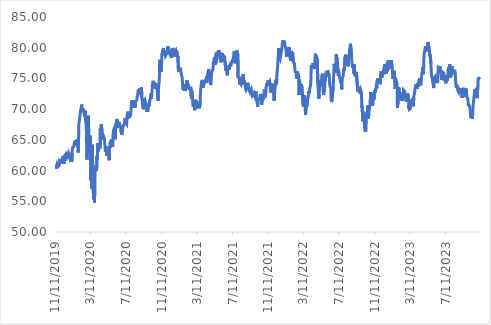
| Category | Series 0 |
|---|---|
| 11/11/19 | 60.478 |
| 11/12/19 | 60.569 |
| 11/13/19 | 60.787 |
| 11/14/19 | 60.569 |
| 11/15/19 | 60.323 |
| 11/18/19 | 61.014 |
| 11/19/19 | 61.042 |
| 11/20/19 | 61.087 |
| 11/21/19 | 60.669 |
| 11/22/19 | 60.632 |
| 11/25/19 | 60.878 |
| 11/26/19 | 61.614 |
| 11/27/19 | 61.514 |
| 11/29/19 | 61.641 |
| 12/2/19 | 61.414 |
| 12/3/19 | 61.169 |
| 12/4/19 | 61.878 |
| 12/5/19 | 61.641 |
| 12/6/19 | 62.023 |
| 12/9/19 | 62.35 |
| 12/10/19 | 61.741 |
| 12/11/19 | 61.314 |
| 12/12/19 | 61.105 |
| 12/13/19 | 62.432 |
| 12/16/19 | 62.596 |
| 12/17/19 | 61.66 |
| 12/18/19 | 62.05 |
| 12/19/19 | 62.114 |
| 12/20/19 | 62.578 |
| 12/23/19 | 62.459 |
| 12/24/19 | 62.305 |
| 12/26/19 | 62.332 |
| 12/27/19 | 62.877 |
| 12/30/19 | 62.523 |
| 12/31/19 | 62.568 |
| 1/2/20 | 61.914 |
| 1/3/20 | 61.823 |
| 1/6/20 | 62.25 |
| 1/7/20 | 61.396 |
| 1/8/20 | 62.959 |
| 1/9/20 | 63.496 |
| 1/10/20 | 63.759 |
| 1/13/20 | 63.75 |
| 1/14/20 | 63.886 |
| 1/15/20 | 64.35 |
| 1/16/20 | 64.304 |
| 1/17/20 | 64.695 |
| 1/21/20 | 64.795 |
| 1/22/20 | 64.493 |
| 1/23/20 | 64.567 |
| 1/24/20 | 64.283 |
| 1/27/20 | 64.1 |
| 1/28/20 | 63.744 |
| 1/29/20 | 62.939 |
| 1/30/20 | 63.524 |
| 1/31/20 | 67.465 |
| 2/3/20 | 68.517 |
| 2/4/20 | 68.947 |
| 2/5/20 | 69.248 |
| 2/6/20 | 69.779 |
| 2/7/20 | 69.523 |
| 2/10/20 | 70.73 |
| 2/11/20 | 69.596 |
| 2/12/20 | 69.45 |
| 2/13/20 | 69.834 |
| 2/14/20 | 70.126 |
| 2/18/20 | 69.559 |
| 2/19/20 | 69.075 |
| 2/20/20 | 68.727 |
| 2/21/20 | 69.742 |
| 2/24/20 | 68.051 |
| 2/25/20 | 67.484 |
| 2/26/20 | 66.679 |
| 2/27/20 | 64.146 |
| 2/28/20 | 61.787 |
| 3/2/20 | 66.24 |
| 3/3/20 | 65.637 |
| 3/4/20 | 68.919 |
| 3/5/20 | 66.149 |
| 3/6/20 | 66.304 |
| 3/9/20 | 64 |
| 3/10/20 | 65.664 |
| 3/11/20 | 63.003 |
| 3/12/20 | 58.422 |
| 3/13/20 | 63.186 |
| 3/16/20 | 57.004 |
| 3/17/20 | 64.192 |
| 3/18/20 | 61.897 |
| 3/19/20 | 60.946 |
| 3/20/20 | 56.767 |
| 3/23/20 | 55.295 |
| 3/24/20 | 55.944 |
| 3/25/20 | 54.764 |
| 3/26/20 | 58.358 |
| 3/27/20 | 59.675 |
| 3/30/20 | 60.882 |
| 3/31/20 | 60.68 |
| 4/1/20 | 59.94 |
| 4/2/20 | 62.335 |
| 4/3/20 | 61.833 |
| 4/6/20 | 64.466 |
| 4/7/20 | 63.131 |
| 4/8/20 | 64.21 |
| 4/9/20 | 63.927 |
| 4/13/20 | 63.542 |
| 4/14/20 | 66.853 |
| 4/15/20 | 66.432 |
| 4/16/20 | 66.606 |
| 4/17/20 | 67.544 |
| 4/20/20 | 66.385 |
| 4/21/20 | 64.959 |
| 4/22/20 | 65.511 |
| 4/23/20 | 65.529 |
| 4/24/20 | 65.686 |
| 4/27/20 | 65.345 |
| 4/28/20 | 65.419 |
| 4/29/20 | 64.545 |
| 4/30/20 | 64.646 |
| 5/1/20 | 63.045 |
| 5/4/20 | 63.919 |
| 5/5/20 | 63.956 |
| 5/6/20 | 62.411 |
| 5/7/20 | 63.294 |
| 5/8/20 | 63.818 |
| 5/11/20 | 63.827 |
| 5/12/20 | 63.229 |
| 5/13/20 | 62.834 |
| 5/14/20 | 61.693 |
| 5/15/20 | 63.432 |
| 5/18/20 | 64.6 |
| 5/19/20 | 63.708 |
| 5/20/20 | 64.83 |
| 5/21/20 | 64.637 |
| 5/22/20 | 65.088 |
| 5/26/20 | 63.873 |
| 5/27/20 | 64.941 |
| 5/28/20 | 66.321 |
| 5/29/20 | 66.541 |
| 6/1/20 | 66.909 |
| 6/2/20 | 66.643 |
| 6/3/20 | 65.916 |
| 6/4/20 | 65.088 |
| 6/5/20 | 66.606 |
| 6/8/20 | 67.627 |
| 6/9/20 | 67.415 |
| 6/10/20 | 68.409 |
| 6/11/20 | 67.25 |
| 6/12/20 | 66.965 |
| 6/15/20 | 67.057 |
| 6/16/20 | 67.645 |
| 6/17/20 | 67.903 |
| 6/18/20 | 67.719 |
| 6/19/20 | 67.489 |
| 6/22/20 | 67.25 |
| 6/23/20 | 67.084 |
| 6/24/20 | 66.265 |
| 6/25/20 | 66.827 |
| 6/26/20 | 65.796 |
| 6/29/20 | 66.633 |
| 6/30/20 | 67.397 |
| 7/1/20 | 67.185 |
| 7/2/20 | 67.415 |
| 7/6/20 | 67.572 |
| 7/7/20 | 68.05 |
| 7/8/20 | 68.529 |
| 7/9/20 | 67.452 |
| 7/10/20 | 67.783 |
| 7/13/20 | 67.581 |
| 7/14/20 | 68.86 |
| 7/15/20 | 68.713 |
| 7/16/20 | 68.979 |
| 7/17/20 | 69.59 |
| 7/20/20 | 68.665 |
| 7/21/20 | 68.517 |
| 7/22/20 | 68.609 |
| 7/23/20 | 68.692 |
| 7/24/20 | 68.776 |
| 7/27/20 | 69.081 |
| 7/28/20 | 70.062 |
| 7/29/20 | 70.515 |
| 7/30/20 | 71.135 |
| 7/31/20 | 71.441 |
| 8/3/20 | 70.858 |
| 8/4/20 | 71.043 |
| 8/5/20 | 70.497 |
| 8/6/20 | 70.201 |
| 8/7/20 | 70.552 |
| 8/10/20 | 70.932 |
| 8/11/20 | 70.293 |
| 8/12/20 | 71.478 |
| 8/13/20 | 71.237 |
| 8/14/20 | 71.302 |
| 8/17/20 | 71.45 |
| 8/18/20 | 71.857 |
| 8/19/20 | 72.135 |
| 8/20/20 | 72.413 |
| 8/21/20 | 72.82 |
| 8/24/20 | 73.227 |
| 8/25/20 | 72.727 |
| 8/26/20 | 72.783 |
| 8/27/20 | 73.162 |
| 8/28/20 | 73.449 |
| 8/31/20 | 73.347 |
| 9/1/20 | 72.264 |
| 9/2/20 | 73.542 |
| 9/3/20 | 71.876 |
| 9/4/20 | 71.45 |
| 9/8/20 | 69.997 |
| 9/9/20 | 71.783 |
| 9/10/20 | 70.71 |
| 9/11/20 | 71.024 |
| 9/14/20 | 71.395 |
| 9/15/20 | 71.2 |
| 9/16/20 | 71.173 |
| 9/17/20 | 70.987 |
| 9/18/20 | 70.173 |
| 9/21/20 | 69.581 |
| 9/22/20 | 70.395 |
| 9/23/20 | 69.535 |
| 9/24/20 | 70.108 |
| 9/25/20 | 70.284 |
| 9/28/20 | 70.895 |
| 9/29/20 | 70.534 |
| 9/30/20 | 71.395 |
| 10/1/20 | 71.311 |
| 10/2/20 | 71.626 |
| 10/5/20 | 72.57 |
| 10/6/20 | 71.756 |
| 10/7/20 | 72.301 |
| 10/8/20 | 72.866 |
| 10/9/20 | 73.819 |
| 10/12/20 | 74.615 |
| 10/13/20 | 74.273 |
| 10/14/20 | 73.902 |
| 10/15/20 | 73.764 |
| 10/16/20 | 74.319 |
| 10/19/20 | 73.301 |
| 10/20/20 | 73.875 |
| 10/21/20 | 74.217 |
| 10/22/20 | 73.78 |
| 10/23/20 | 73.826 |
| 10/26/20 | 73.221 |
| 10/27/20 | 73.37 |
| 10/28/20 | 71.519 |
| 10/29/20 | 71.342 |
| 10/30/20 | 73.408 |
| 11/2/20 | 74.589 |
| 11/3/20 | 77.334 |
| 11/4/20 | 78.032 |
| 11/5/20 | 77.241 |
| 11/6/20 | 77.26 |
| 11/9/20 | 76.097 |
| 11/10/20 | 77.558 |
| 11/11/20 | 79.028 |
| 11/12/20 | 78.842 |
| 11/13/20 | 79.428 |
| 11/16/20 | 79.958 |
| 11/17/20 | 79.419 |
| 11/18/20 | 78.73 |
| 11/19/20 | 79.446 |
| 11/20/20 | 79.242 |
| 11/23/20 | 78.665 |
| 11/24/20 | 78.823 |
| 11/25/20 | 78.86 |
| 11/27/20 | 79 |
| 11/30/20 | 79.688 |
| 12/1/20 | 80.265 |
| 12/2/20 | 79.781 |
| 12/3/20 | 79.27 |
| 12/4/20 | 79.121 |
| 12/7/20 | 79.456 |
| 12/8/20 | 79.251 |
| 12/9/20 | 78.86 |
| 12/10/20 | 78.711 |
| 12/11/20 | 78.795 |
| 12/14/20 | 78.339 |
| 12/15/20 | 78.86 |
| 12/16/20 | 79.13 |
| 12/17/20 | 79.707 |
| 12/18/20 | 79.958 |
| 12/21/20 | 79.381 |
| 12/22/20 | 78.535 |
| 12/23/20 | 78.563 |
| 12/24/20 | 79.13 |
| 12/28/20 | 79.474 |
| 12/29/20 | 79.121 |
| 12/30/20 | 78.842 |
| 12/31/20 | 79.567 |
| 1/4/21 | 78.469 |
| 1/5/21 | 78.646 |
| 1/6/21 | 76.534 |
| 1/7/21 | 76.115 |
| 1/8/21 | 76.627 |
| 1/11/21 | 76.432 |
| 1/12/21 | 76.543 |
| 1/13/21 | 76.757 |
| 1/14/21 | 76.246 |
| 1/15/21 | 76.19 |
| 1/19/21 | 75.231 |
| 1/20/21 | 74.626 |
| 1/21/21 | 73.77 |
| 1/22/21 | 73.162 |
| 1/25/21 | 73.555 |
| 1/26/21 | 73.686 |
| 1/27/21 | 73.013 |
| 1/28/21 | 74.061 |
| 1/29/21 | 72.984 |
| 2/1/21 | 73.471 |
| 2/2/21 | 73.78 |
| 2/3/21 | 73.808 |
| 2/4/21 | 73.855 |
| 2/5/21 | 74.734 |
| 2/8/21 | 74.575 |
| 2/9/21 | 73.639 |
| 2/10/21 | 74.023 |
| 2/11/21 | 73.368 |
| 2/12/21 | 73.387 |
| 2/16/21 | 73.162 |
| 2/17/21 | 73.396 |
| 2/18/21 | 73.658 |
| 2/19/21 | 72.236 |
| 2/22/21 | 72.301 |
| 2/23/21 | 72.507 |
| 2/24/21 | 71.712 |
| 2/25/21 | 71.759 |
| 2/26/21 | 70.364 |
| 3/1/21 | 70.739 |
| 3/2/21 | 70.57 |
| 3/3/21 | 69.812 |
| 3/4/21 | 69.653 |
| 3/5/21 | 71.169 |
| 3/8/21 | 71.534 |
| 3/9/21 | 70.121 |
| 3/10/21 | 70.926 |
| 3/11/21 | 70.43 |
| 3/12/21 | 70.655 |
| 3/15/21 | 70.814 |
| 3/16/21 | 70.982 |
| 3/17/21 | 70.926 |
| 3/18/21 | 71.179 |
| 3/19/21 | 70.159 |
| 3/22/21 | 70.898 |
| 3/23/21 | 72.751 |
| 3/24/21 | 72.769 |
| 3/25/21 | 72.882 |
| 3/26/21 | 74.126 |
| 3/29/21 | 74.762 |
| 3/30/21 | 74.229 |
| 3/31/21 | 73.761 |
| 4/1/21 | 73.499 |
| 4/5/21 | 74.416 |
| 4/6/21 | 74.725 |
| 4/7/21 | 74.5 |
| 4/8/21 | 74.519 |
| 4/9/21 | 74.65 |
| 4/12/21 | 75.006 |
| 4/13/21 | 74.603 |
| 4/14/21 | 74.294 |
| 4/15/21 | 75.286 |
| 4/16/21 | 75.511 |
| 4/19/21 | 75.202 |
| 4/20/21 | 76.529 |
| 4/21/21 | 76.359 |
| 4/22/21 | 76.265 |
| 4/23/21 | 75.08 |
| 4/26/21 | 74.6 |
| 4/27/21 | 73.922 |
| 4/28/21 | 74.12 |
| 4/29/21 | 75.108 |
| 4/30/21 | 75.936 |
| 5/3/21 | 76.284 |
| 5/4/21 | 76.303 |
| 5/5/21 | 76.519 |
| 5/6/21 | 77.451 |
| 5/7/21 | 77.329 |
| 5/10/21 | 78.42 |
| 5/11/21 | 77.573 |
| 5/12/21 | 77.206 |
| 5/13/21 | 78.345 |
| 5/14/21 | 78.627 |
| 5/17/21 | 78.618 |
| 5/18/21 | 78.204 |
| 5/19/21 | 78.298 |
| 5/20/21 | 79.126 |
| 5/21/21 | 79.258 |
| 5/24/21 | 79.418 |
| 5/25/21 | 79.596 |
| 5/26/21 | 79.446 |
| 5/27/21 | 78.749 |
| 5/28/21 | 78.834 |
| 6/1/21 | 77.611 |
| 6/2/21 | 77.987 |
| 6/3/21 | 78.994 |
| 6/4/21 | 79.013 |
| 6/7/21 | 78.947 |
| 6/8/21 | 78.034 |
| 6/9/21 | 77.686 |
| 6/10/21 | 78.665 |
| 6/11/21 | 78.693 |
| 6/14/21 | 78.486 |
| 6/15/21 | 78.354 |
| 6/16/21 | 77.112 |
| 6/17/21 | 77.564 |
| 6/18/21 | 76.237 |
| 6/21/21 | 76.632 |
| 6/22/21 | 76.491 |
| 6/23/21 | 75.513 |
| 6/24/21 | 75.804 |
| 6/25/21 | 76.651 |
| 6/28/21 | 76.896 |
| 6/29/21 | 76.454 |
| 6/30/21 | 76.548 |
| 7/1/21 | 76.915 |
| 7/2/21 | 76.877 |
| 7/6/21 | 77.131 |
| 7/7/21 | 77.78 |
| 7/8/21 | 77.479 |
| 7/9/21 | 77.564 |
| 7/12/21 | 78.034 |
| 7/13/21 | 77.761 |
| 7/14/21 | 78.317 |
| 7/15/21 | 78.693 |
| 7/16/21 | 79.408 |
| 7/19/21 | 79.013 |
| 7/20/21 | 78.228 |
| 7/21/21 | 77.745 |
| 7/22/21 | 77.424 |
| 7/23/21 | 78.786 |
| 7/26/21 | 79.552 |
| 7/27/21 | 79.42 |
| 7/28/21 | 78.691 |
| 7/29/21 | 79.013 |
| 7/30/21 | 75.21 |
| 8/2/21 | 75.248 |
| 8/3/21 | 75.134 |
| 8/4/21 | 74.027 |
| 8/5/21 | 74.642 |
| 8/6/21 | 74.387 |
| 8/9/21 | 74.112 |
| 8/10/21 | 74.481 |
| 8/11/21 | 74.831 |
| 8/12/21 | 74.538 |
| 8/13/21 | 75.153 |
| 8/16/21 | 75.475 |
| 8/17/21 | 75.711 |
| 8/18/21 | 73.942 |
| 8/19/21 | 74.708 |
| 8/20/21 | 74.548 |
| 8/23/21 | 74.15 |
| 8/24/21 | 73.479 |
| 8/25/21 | 73.46 |
| 8/26/21 | 73.138 |
| 8/27/21 | 73.261 |
| 8/30/21 | 73.46 |
| 8/31/21 | 73.744 |
| 9/1/21 | 74.103 |
| 9/2/21 | 74.283 |
| 9/3/21 | 73.706 |
| 9/7/21 | 72.75 |
| 9/8/21 | 73.583 |
| 9/9/21 | 73.129 |
| 9/10/21 | 72.883 |
| 9/13/21 | 73.204 |
| 9/14/21 | 73.129 |
| 9/15/21 | 73.043 |
| 9/16/21 | 72.343 |
| 9/17/21 | 72.116 |
| 9/20/21 | 72.06 |
| 9/21/21 | 72.268 |
| 9/22/21 | 72.306 |
| 9/23/21 | 72.533 |
| 9/24/21 | 72.495 |
| 9/27/21 | 71.908 |
| 9/28/21 | 71.728 |
| 9/29/21 | 72.92 |
| 9/30/21 | 71.501 |
| 10/1/21 | 71.501 |
| 10/4/21 | 71.009 |
| 10/5/21 | 70.404 |
| 10/6/21 | 71.047 |
| 10/7/21 | 71.511 |
| 10/8/21 | 71.511 |
| 10/11/21 | 71.71 |
| 10/12/21 | 71.587 |
| 10/13/21 | 71.965 |
| 10/14/21 | 72.466 |
| 10/15/21 | 72.135 |
| 10/18/21 | 71.218 |
| 10/19/21 | 70.745 |
| 10/20/21 | 71.477 |
| 10/21/21 | 71.278 |
| 10/22/21 | 71.858 |
| 10/25/21 | 71.516 |
| 10/26/21 | 72.486 |
| 10/27/21 | 72.239 |
| 10/28/21 | 73.172 |
| 10/29/21 | 72.515 |
| 11/1/21 | 72.286 |
| 11/2/21 | 72.591 |
| 11/3/21 | 73.543 |
| 11/4/21 | 73.562 |
| 11/5/21 | 74.085 |
| 11/8/21 | 73.99 |
| 11/9/21 | 74.285 |
| 11/10/21 | 74.694 |
| 11/11/21 | 74.228 |
| 11/12/21 | 74.266 |
| 11/15/21 | 74.523 |
| 11/16/21 | 74.123 |
| 11/17/21 | 73.838 |
| 11/18/21 | 72.705 |
| 11/19/21 | 73.476 |
| 11/22/21 | 73.819 |
| 11/23/21 | 74.171 |
| 11/24/21 | 74.009 |
| 11/26/21 | 73.343 |
| 11/29/21 | 73.962 |
| 11/30/21 | 71.401 |
| 12/1/21 | 71.753 |
| 12/2/21 | 71.839 |
| 12/3/21 | 73.067 |
| 12/6/21 | 74.79 |
| 12/7/21 | 74.057 |
| 12/8/21 | 74.009 |
| 12/9/21 | 74.238 |
| 12/10/21 | 75.637 |
| 12/13/21 | 77.226 |
| 12/14/21 | 78.168 |
| 12/15/21 | 78.768 |
| 12/16/21 | 79.901 |
| 12/17/21 | 78.501 |
| 12/20/21 | 78.54 |
| 12/21/21 | 78.13 |
| 12/22/21 | 78.482 |
| 12/23/21 | 78.797 |
| 12/27/21 | 79.862 |
| 12/28/21 | 80.386 |
| 12/29/21 | 80.814 |
| 12/30/21 | 80.51 |
| 12/31/21 | 81.224 |
| 1/3/22 | 80.51 |
| 1/4/22 | 80.776 |
| 1/5/22 | 81.109 |
| 1/6/22 | 80.576 |
| 1/7/22 | 80.367 |
| 1/10/22 | 79.672 |
| 1/11/22 | 79.158 |
| 1/12/22 | 78.873 |
| 1/13/22 | 78.559 |
| 1/14/22 | 79.425 |
| 1/18/22 | 79.111 |
| 1/19/22 | 80.005 |
| 1/20/22 | 79.272 |
| 1/21/22 | 80.067 |
| 1/24/22 | 80.067 |
| 1/25/22 | 78.22 |
| 1/26/22 | 77.885 |
| 1/27/22 | 79.138 |
| 1/28/22 | 79.473 |
| 1/31/22 | 78.899 |
| 2/1/22 | 78.392 |
| 2/2/22 | 79.234 |
| 2/3/22 | 79.167 |
| 2/4/22 | 77.626 |
| 2/7/22 | 77.626 |
| 2/8/22 | 77.435 |
| 2/9/22 | 77.387 |
| 2/10/22 | 76.287 |
| 2/11/22 | 76.105 |
| 2/14/22 | 75.847 |
| 2/15/22 | 75.196 |
| 2/16/22 | 74.966 |
| 2/17/22 | 75.741 |
| 2/18/22 | 76.124 |
| 2/22/22 | 75.454 |
| 2/23/22 | 75.253 |
| 2/24/22 | 72.325 |
| 2/25/22 | 74.775 |
| 2/28/22 | 73.636 |
| 3/1/22 | 72.765 |
| 3/2/22 | 73.397 |
| 3/3/22 | 74.067 |
| 3/4/22 | 74.028 |
| 3/7/22 | 73.378 |
| 3/8/22 | 71.646 |
| 3/9/22 | 72.287 |
| 3/10/22 | 70.66 |
| 3/11/22 | 70.593 |
| 3/14/22 | 70.775 |
| 3/15/22 | 72.239 |
| 3/16/22 | 71.914 |
| 3/17/22 | 71.894 |
| 3/18/22 | 69.091 |
| 3/21/22 | 70.957 |
| 3/22/22 | 71.292 |
| 3/23/22 | 70.459 |
| 3/24/22 | 70.478 |
| 3/25/22 | 71.56 |
| 3/28/22 | 72.143 |
| 3/29/22 | 72.918 |
| 3/30/22 | 73.071 |
| 3/31/22 | 72.564 |
| 4/1/22 | 73.129 |
| 4/4/22 | 73.292 |
| 4/5/22 | 74.115 |
| 4/6/22 | 75.416 |
| 4/7/22 | 76.957 |
| 4/8/22 | 76.794 |
| 4/11/22 | 76.976 |
| 4/12/22 | 77.512 |
| 4/13/22 | 77.502 |
| 4/14/22 | 77.454 |
| 4/18/22 | 76.564 |
| 4/19/22 | 77.138 |
| 4/20/22 | 78.476 |
| 4/21/22 | 79.025 |
| 4/22/22 | 78.062 |
| 4/25/22 | 78.746 |
| 4/26/22 | 77.504 |
| 4/27/22 | 77.668 |
| 4/28/22 | 78.178 |
| 4/29/22 | 74.164 |
| 5/2/22 | 72.364 |
| 5/3/22 | 71.7 |
| 5/4/22 | 74.116 |
| 5/5/22 | 73.24 |
| 5/6/22 | 73.962 |
| 5/9/22 | 74.761 |
| 5/10/22 | 73.798 |
| 5/11/22 | 73.875 |
| 5/12/22 | 74.645 |
| 5/13/22 | 75.464 |
| 5/16/22 | 75.781 |
| 5/17/22 | 75.82 |
| 5/18/22 | 72.874 |
| 5/19/22 | 72.306 |
| 5/20/22 | 72.316 |
| 5/23/22 | 73.654 |
| 5/24/22 | 75.194 |
| 5/25/22 | 74.588 |
| 5/26/22 | 75.233 |
| 5/27/22 | 75.906 |
| 5/31/22 | 75.858 |
| 6/1/22 | 75.271 |
| 6/2/22 | 76.301 |
| 6/3/22 | 75.974 |
| 6/6/22 | 75.829 |
| 6/7/22 | 75.762 |
| 6/8/22 | 74.953 |
| 6/9/22 | 73.972 |
| 6/10/22 | 73.76 |
| 6/13/22 | 73.336 |
| 6/14/22 | 71.488 |
| 6/15/22 | 71.382 |
| 6/16/22 | 71.151 |
| 6/17/22 | 71.267 |
| 6/21/22 | 73.596 |
| 6/22/22 | 74.992 |
| 6/23/22 | 75.926 |
| 6/24/22 | 77.369 |
| 6/27/22 | 76.888 |
| 6/28/22 | 75.926 |
| 6/29/22 | 76.686 |
| 6/30/22 | 77.138 |
| 7/1/22 | 78.9 |
| 7/5/22 | 77.966 |
| 7/6/22 | 77.985 |
| 7/7/22 | 76.484 |
| 7/8/22 | 75.415 |
| 7/11/22 | 75.752 |
| 7/12/22 | 75.377 |
| 7/13/22 | 75.492 |
| 7/14/22 | 75.406 |
| 7/15/22 | 75.223 |
| 7/18/22 | 74.232 |
| 7/19/22 | 74.626 |
| 7/20/22 | 73.222 |
| 7/21/22 | 73.755 |
| 7/22/22 | 75.023 |
| 7/25/22 | 75.391 |
| 7/26/22 | 76.05 |
| 7/27/22 | 76.272 |
| 7/28/22 | 76.689 |
| 7/29/22 | 76.253 |
| 8/1/22 | 78.539 |
| 8/2/22 | 77.725 |
| 8/3/22 | 78.858 |
| 8/4/22 | 78.335 |
| 8/5/22 | 77.89 |
| 8/8/22 | 78.258 |
| 8/9/22 | 77.531 |
| 8/10/22 | 77.803 |
| 8/11/22 | 76.989 |
| 8/12/22 | 77.754 |
| 8/15/22 | 78.674 |
| 8/16/22 | 79.584 |
| 8/17/22 | 79.575 |
| 8/18/22 | 80.233 |
| 8/19/22 | 80.64 |
| 8/22/22 | 79.371 |
| 8/23/22 | 78.403 |
| 8/24/22 | 78.442 |
| 8/25/22 | 78.364 |
| 8/26/22 | 76.708 |
| 8/29/22 | 77.076 |
| 8/30/22 | 76.505 |
| 8/31/22 | 75.74 |
| 9/1/22 | 77.28 |
| 9/2/22 | 75.701 |
| 9/6/22 | 75.314 |
| 9/7/22 | 76.069 |
| 9/8/22 | 75.382 |
| 9/9/22 | 75.566 |
| 9/12/22 | 75.44 |
| 9/13/22 | 73.048 |
| 9/14/22 | 73.658 |
| 9/15/22 | 72.854 |
| 9/16/22 | 73.299 |
| 9/19/22 | 73.609 |
| 9/20/22 | 72.786 |
| 9/21/22 | 72.534 |
| 9/22/22 | 72.98 |
| 9/23/22 | 73.145 |
| 9/26/22 | 72.631 |
| 9/27/22 | 70.288 |
| 9/28/22 | 70.607 |
| 9/29/22 | 69.503 |
| 9/30/22 | 68.031 |
| 10/3/22 | 68.864 |
| 10/4/22 | 69.571 |
| 10/5/22 | 68.864 |
| 10/6/22 | 67.363 |
| 10/7/22 | 66.811 |
| 10/10/22 | 66.317 |
| 10/11/22 | 66.869 |
| 10/12/22 | 66.927 |
| 10/13/22 | 68.767 |
| 10/14/22 | 69.077 |
| 10/17/22 | 69.862 |
| 10/18/22 | 70.617 |
| 10/19/22 | 69.484 |
| 10/20/22 | 68.48 |
| 10/21/22 | 69.669 |
| 10/24/22 | 70.205 |
| 10/25/22 | 70.927 |
| 10/26/22 | 71.58 |
| 10/27/22 | 71.385 |
| 10/28/22 | 72.759 |
| 10/31/22 | 71.979 |
| 11/1/22 | 71.882 |
| 11/2/22 | 70.936 |
| 11/3/22 | 70.566 |
| 11/4/22 | 71.346 |
| 11/7/22 | 71.648 |
| 11/8/22 | 71.95 |
| 11/9/22 | 71.609 |
| 11/10/22 | 73.081 |
| 11/11/22 | 72.691 |
| 11/14/22 | 72.691 |
| 11/15/22 | 73.422 |
| 11/16/22 | 74.095 |
| 11/17/22 | 73.393 |
| 11/18/22 | 74.533 |
| 11/21/22 | 74.982 |
| 11/22/22 | 74.446 |
| 11/23/22 | 74.992 |
| 11/25/22 | 74.836 |
| 11/28/22 | 74.455 |
| 11/29/22 | 74.056 |
| 11/30/22 | 75.528 |
| 12/1/22 | 75.791 |
| 12/2/22 | 76.2 |
| 12/5/22 | 75.177 |
| 12/6/22 | 75.264 |
| 12/7/22 | 75.596 |
| 12/8/22 | 76.171 |
| 12/9/22 | 75.82 |
| 12/12/22 | 76.629 |
| 12/13/22 | 76.766 |
| 12/14/22 | 77.341 |
| 12/15/22 | 75.918 |
| 12/16/22 | 75.801 |
| 12/19/22 | 76.015 |
| 12/20/22 | 75.732 |
| 12/21/22 | 77 |
| 12/22/22 | 77.282 |
| 12/23/22 | 77.448 |
| 12/27/22 | 77.926 |
| 12/28/22 | 76.834 |
| 12/29/22 | 77.37 |
| 12/30/22 | 76.805 |
| 1/3/23 | 77.136 |
| 1/4/23 | 77.633 |
| 1/5/23 | 76.561 |
| 1/6/23 | 77.965 |
| 1/9/23 | 76.746 |
| 1/10/23 | 76.337 |
| 1/11/23 | 75.186 |
| 1/12/23 | 74.904 |
| 1/13/23 | 75.888 |
| 1/17/23 | 76.259 |
| 1/18/23 | 74.397 |
| 1/19/23 | 73.305 |
| 1/20/23 | 74.002 |
| 1/23/23 | 74.06 |
| 1/24/23 | 74.492 |
| 1/25/23 | 74.325 |
| 1/26/23 | 74.09 |
| 1/27/23 | 70.225 |
| 1/30/23 | 71.49 |
| 1/31/23 | 73.109 |
| 2/1/23 | 73.56 |
| 2/2/23 | 72.324 |
| 2/3/23 | 72.874 |
| 2/6/23 | 72.442 |
| 2/7/23 | 72.05 |
| 2/8/23 | 71.961 |
| 2/9/23 | 71.441 |
| 2/10/23 | 72.148 |
| 2/13/23 | 72.363 |
| 2/14/23 | 71.785 |
| 2/15/23 | 71.314 |
| 2/16/23 | 71.382 |
| 2/17/23 | 73.099 |
| 2/21/23 | 72.844 |
| 2/22/23 | 72.991 |
| 2/23/23 | 72.256 |
| 2/24/23 | 71.736 |
| 2/27/23 | 72.197 |
| 2/28/23 | 71.902 |
| 3/1/23 | 71.167 |
| 3/2/23 | 72.363 |
| 3/3/23 | 72.54 |
| 3/6/23 | 71.893 |
| 3/7/23 | 70.137 |
| 3/8/23 | 70.588 |
| 3/9/23 | 69.98 |
| 3/10/23 | 69.95 |
| 3/13/23 | 70.137 |
| 3/14/23 | 70.863 |
| 3/15/23 | 71.539 |
| 3/16/23 | 71.559 |
| 3/17/23 | 70.823 |
| 3/20/23 | 71.687 |
| 3/21/23 | 71 |
| 3/22/23 | 70.755 |
| 3/23/23 | 70.46 |
| 3/24/23 | 72.02 |
| 3/27/23 | 72.736 |
| 3/28/23 | 73.08 |
| 3/29/23 | 73.05 |
| 3/30/23 | 73.815 |
| 3/31/23 | 73.717 |
| 4/3/23 | 73.923 |
| 4/4/23 | 73.305 |
| 4/5/23 | 73.923 |
| 4/6/23 | 74.237 |
| 4/10/23 | 73.707 |
| 4/11/23 | 74.571 |
| 4/12/23 | 74.6 |
| 4/13/23 | 75.061 |
| 4/14/23 | 74.149 |
| 4/17/23 | 74.257 |
| 4/18/23 | 74.1 |
| 4/19/23 | 74.149 |
| 4/20/23 | 75.383 |
| 4/21/23 | 75.817 |
| 4/24/23 | 76.883 |
| 4/25/23 | 76.706 |
| 4/26/23 | 75.699 |
| 4/27/23 | 76.933 |
| 4/28/23 | 78.779 |
| 5/1/23 | 79.657 |
| 5/2/23 | 79.815 |
| 5/3/23 | 80.22 |
| 5/4/23 | 79.756 |
| 5/5/23 | 79.559 |
| 5/8/23 | 79.717 |
| 5/9/23 | 79.608 |
| 5/10/23 | 80.062 |
| 5/11/23 | 80.585 |
| 5/12/23 | 80.931 |
| 5/15/23 | 80.042 |
| 5/16/23 | 79.736 |
| 5/17/23 | 79.48 |
| 5/18/23 | 78.67 |
| 5/19/23 | 78.907 |
| 5/22/23 | 77.406 |
| 5/23/23 | 76.054 |
| 5/24/23 | 75.501 |
| 5/25/23 | 75.274 |
| 5/26/23 | 75.235 |
| 5/30/23 | 73.991 |
| 5/31/23 | 73.428 |
| 6/1/23 | 73.941 |
| 6/2/23 | 75.077 |
| 6/5/23 | 75.274 |
| 6/6/23 | 74.603 |
| 6/7/23 | 74.238 |
| 6/8/23 | 74.761 |
| 6/9/23 | 74.869 |
| 6/12/23 | 74.751 |
| 6/13/23 | 74.277 |
| 6/14/23 | 74.455 |
| 6/15/23 | 75.817 |
| 6/16/23 | 76.785 |
| 6/20/23 | 76.627 |
| 6/21/23 | 76.627 |
| 6/22/23 | 77.002 |
| 6/23/23 | 76.123 |
| 6/26/23 | 75.659 |
| 6/27/23 | 74.761 |
| 6/28/23 | 74.938 |
| 6/29/23 | 75.58 |
| 6/30/23 | 76.054 |
| 7/3/23 | 76.153 |
| 7/5/23 | 75.886 |
| 7/6/23 | 75.926 |
| 7/7/23 | 74.623 |
| 7/10/23 | 74.919 |
| 7/11/23 | 74.425 |
| 7/12/23 | 74.198 |
| 7/13/23 | 74.889 |
| 7/14/23 | 75.462 |
| 7/17/23 | 74.613 |
| 7/18/23 | 74.869 |
| 7/19/23 | 75.442 |
| 7/20/23 | 76.495 |
| 7/21/23 | 76.684 |
| 7/24/23 | 76.972 |
| 7/25/23 | 77.329 |
| 7/26/23 | 77.449 |
| 7/27/23 | 76.604 |
| 7/28/23 | 75.124 |
| 7/31/23 | 75.76 |
| 8/1/23 | 76.137 |
| 8/2/23 | 77.031 |
| 8/3/23 | 76.078 |
| 8/4/23 | 75.76 |
| 8/7/23 | 76.396 |
| 8/8/23 | 75.829 |
| 8/9/23 | 75.988 |
| 8/10/23 | 75.78 |
| 8/11/23 | 76.396 |
| 8/14/23 | 75.223 |
| 8/15/23 | 74.15 |
| 8/16/23 | 73.932 |
| 8/17/23 | 73.515 |
| 8/18/23 | 74.061 |
| 8/21/23 | 73.316 |
| 8/22/23 | 73.028 |
| 8/23/23 | 73.028 |
| 8/24/23 | 72.839 |
| 8/25/23 | 73.346 |
| 8/28/23 | 73.157 |
| 8/29/23 | 72.988 |
| 8/30/23 | 73.366 |
| 8/31/23 | 72.988 |
| 9/1/23 | 72.789 |
| 9/5/23 | 72.303 |
| 9/6/23 | 71.846 |
| 9/7/23 | 73.078 |
| 9/8/23 | 72.72 |
| 9/11/23 | 73.465 |
| 9/12/23 | 72.044 |
| 9/13/23 | 72.352 |
| 9/14/23 | 72.978 |
| 9/15/23 | 72.69 |
| 9/18/23 | 73.366 |
| 9/19/23 | 72.74 |
| 9/20/23 | 73.276 |
| 9/21/23 | 72.74 |
| 9/22/23 | 71.975 |
| 9/25/23 | 71.746 |
| 9/26/23 | 71.528 |
| 9/27/23 | 70.584 |
| 9/28/23 | 70.842 |
| 9/29/23 | 70.644 |
| 10/2/23 | 70.296 |
| 10/3/23 | 70.008 |
| 10/4/23 | 70.097 |
| 10/5/23 | 68.816 |
| 10/6/23 | 68.975 |
| 10/9/23 | 68.855 |
| 10/10/23 | 69.034 |
| 10/11/23 | 68.418 |
| 10/12/23 | 69.243 |
| 10/13/23 | 70.485 |
| 10/16/23 | 71.677 |
| 10/17/23 | 71.607 |
| 10/18/23 | 72.591 |
| 10/19/23 | 72.71 |
| 10/20/23 | 73.27 |
| 10/23/23 | 71.96 |
| 10/24/23 | 72.84 |
| 10/25/23 | 73.41 |
| 10/26/23 | 73.08 |
| 10/27/23 | 71.79 |
| 10/30/23 | 73.88 |
| 10/31/23 | 75.12 |
| 11/1/23 | 74.93 |
| 11/2/23 | 74.8 |
| 11/3/23 | 74.82 |
| 11/6/23 | 75.21 |
| 11/7/23 | 75.23 |
| 11/8/23 | 75.24 |
| 11/9/23 | 75.14 |